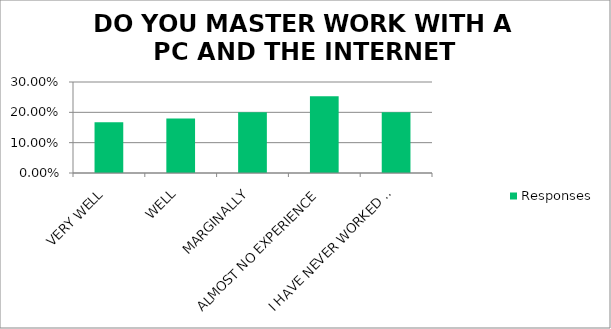
| Category | Responses |
|---|---|
| VERY WELL | 0.168 |
| WELL | 0.18 |
| MARGINALLY | 0.2 |
| ALMOST NO EXPERIENCE | 0.253 |
| I HAVE NEVER WORKED WITH A PC | 0.2 |